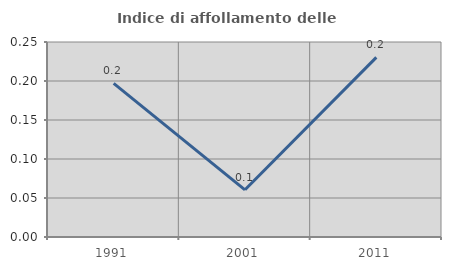
| Category | Indice di affollamento delle abitazioni  |
|---|---|
| 1991.0 | 0.197 |
| 2001.0 | 0.06 |
| 2011.0 | 0.23 |